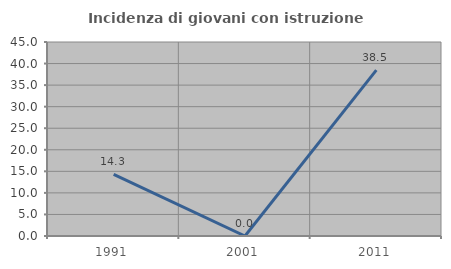
| Category | Incidenza di giovani con istruzione universitaria |
|---|---|
| 1991.0 | 14.286 |
| 2001.0 | 0 |
| 2011.0 | 38.462 |